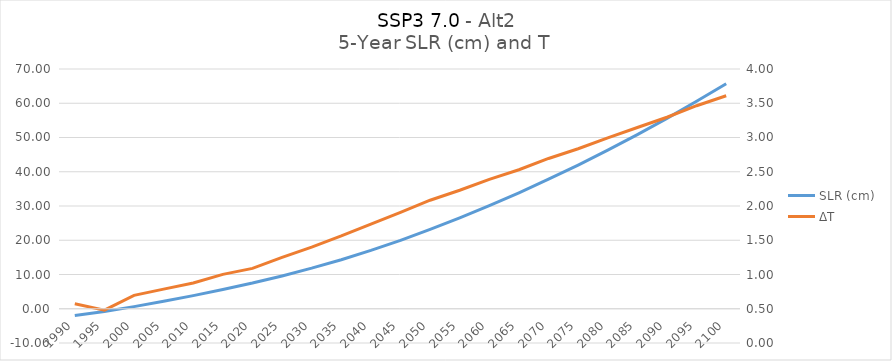
| Category | SLR (cm) |
|---|---|
| 1990.0 | -1.941 |
| 1995.0 | -0.818 |
| 2000.0 | 0.621 |
| 2005.0 | 2.18 |
| 2010.0 | 3.834 |
| 2015.0 | 5.633 |
| 2020.0 | 7.505 |
| 2025.0 | 9.582 |
| 2030.0 | 11.846 |
| 2035.0 | 14.321 |
| 2040.0 | 17.029 |
| 2045.0 | 19.966 |
| 2050.0 | 23.15 |
| 2055.0 | 26.517 |
| 2060.0 | 30.096 |
| 2065.0 | 33.844 |
| 2070.0 | 37.815 |
| 2075.0 | 41.959 |
| 2080.0 | 46.313 |
| 2085.0 | 50.86 |
| 2090.0 | 55.597 |
| 2095.0 | 60.566 |
| 2100.0 | 65.716 |